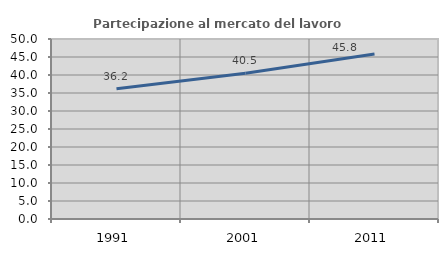
| Category | Partecipazione al mercato del lavoro  femminile |
|---|---|
| 1991.0 | 36.192 |
| 2001.0 | 40.495 |
| 2011.0 | 45.816 |